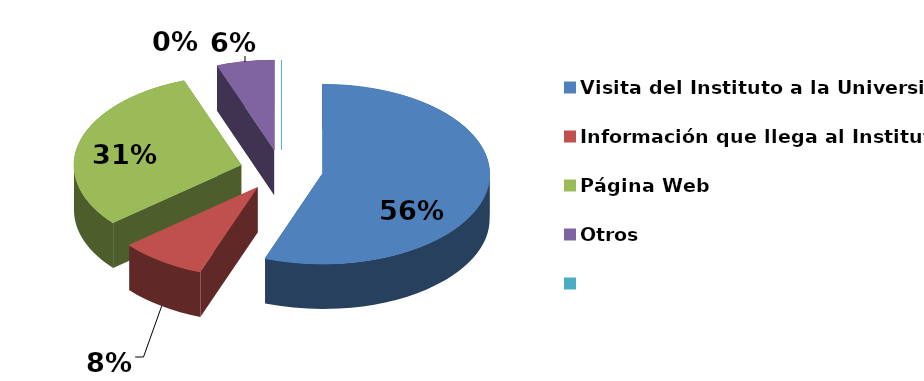
| Category | Series 0 |
|---|---|
| Visita del Instituto a la Universidad | 20 |
| Información que llega al Instituto | 3 |
| Página Web | 11 |
| Otros | 2 |